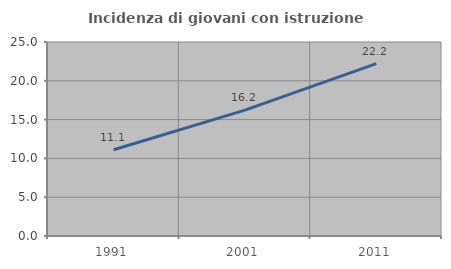
| Category | Incidenza di giovani con istruzione universitaria |
|---|---|
| 1991.0 | 11.111 |
| 2001.0 | 16.216 |
| 2011.0 | 22.222 |